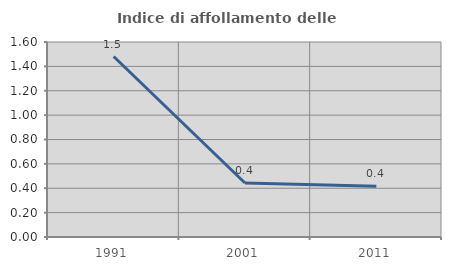
| Category | Indice di affollamento delle abitazioni  |
|---|---|
| 1991.0 | 1.481 |
| 2001.0 | 0.443 |
| 2011.0 | 0.417 |